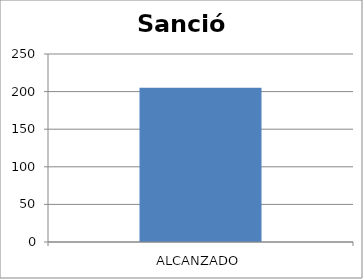
| Category | Sanción |
|---|---|
| ALCANZADO | 205 |